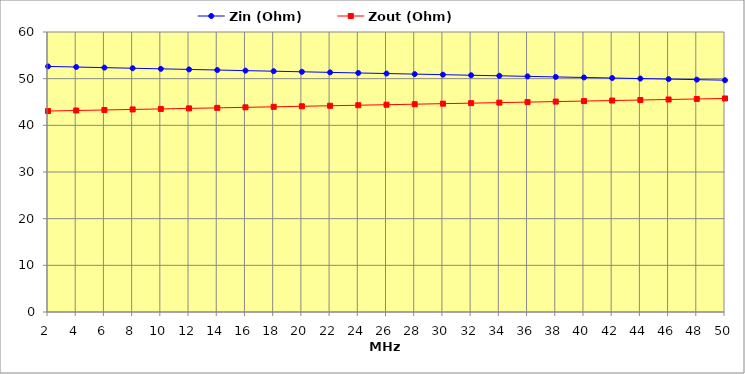
| Category | Zin (Ohm) | Zout (Ohm) |
|---|---|---|
| 2.0 | 52.627 | 43.064 |
| 4.0 | 52.495 | 43.177 |
| 6.0 | 52.365 | 43.291 |
| 8.0 | 52.235 | 43.404 |
| 10.0 | 52.106 | 43.517 |
| 12.0 | 51.978 | 43.63 |
| 14.0 | 51.851 | 43.743 |
| 16.0 | 51.724 | 43.855 |
| 18.0 | 51.598 | 43.968 |
| 20.0 | 51.473 | 44.081 |
| 22.0 | 51.348 | 44.193 |
| 24.0 | 51.224 | 44.306 |
| 26.0 | 51.101 | 44.418 |
| 28.0 | 50.978 | 44.53 |
| 30.0 | 50.856 | 44.642 |
| 32.0 | 50.735 | 44.754 |
| 34.0 | 50.615 | 44.866 |
| 36.0 | 50.495 | 44.978 |
| 38.0 | 50.376 | 45.09 |
| 40.0 | 50.257 | 45.202 |
| 42.0 | 50.139 | 45.313 |
| 44.0 | 50.022 | 45.425 |
| 46.0 | 49.905 | 45.536 |
| 48.0 | 49.79 | 45.648 |
| 50.0 | 49.674 | 45.759 |